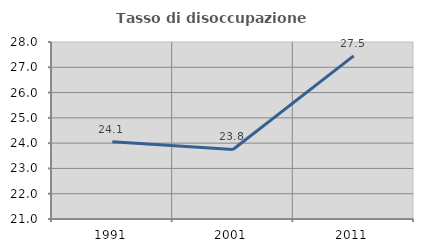
| Category | Tasso di disoccupazione giovanile  |
|---|---|
| 1991.0 | 24.051 |
| 2001.0 | 23.75 |
| 2011.0 | 27.451 |